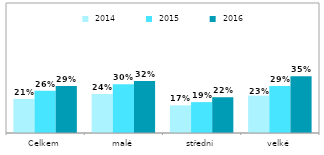
| Category |  2014 |  2015 |  2016 |
|---|---|---|---|
| Celkem | 0.21 | 0.26 | 0.29 |
| malé | 0.24 | 0.3 | 0.32 |
| střední | 0.17 | 0.19 | 0.22 |
| velké | 0.23 | 0.29 | 0.35 |